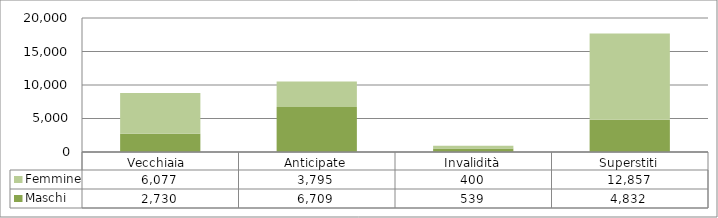
| Category | Maschi | Femmine |
|---|---|---|
| Vecchiaia  | 2730 | 6077 |
| Anticipate | 6709 | 3795 |
| Invalidità | 539 | 400 |
| Superstiti | 4832 | 12857 |